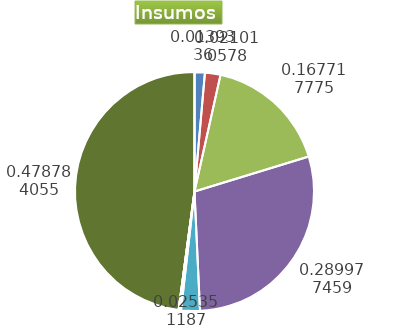
| Category | Series 0 |
|---|---|
| Control arvenses | 1212542 |
| Control fitosanitario | 1828401 |
| Cosecha y beneficio | 14595284.015 |
| Fertilización | 25234674.021 |
| Instalación | 2206133.315 |
| Otros | 280679 |
| Podas | 0 |
| Riego | 0 |
| Transporte | 41665168 |
| Tutorado | 0 |